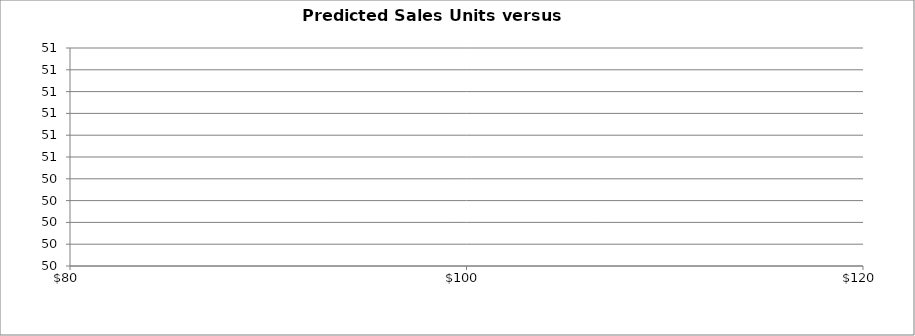
| Category | Regression Line |
|---|---|
| 90.0 | 0 |
| 95.0 | 0 |
| 100.0 | 0 |
| 105.0 | 0 |
| 110.0 | 0 |